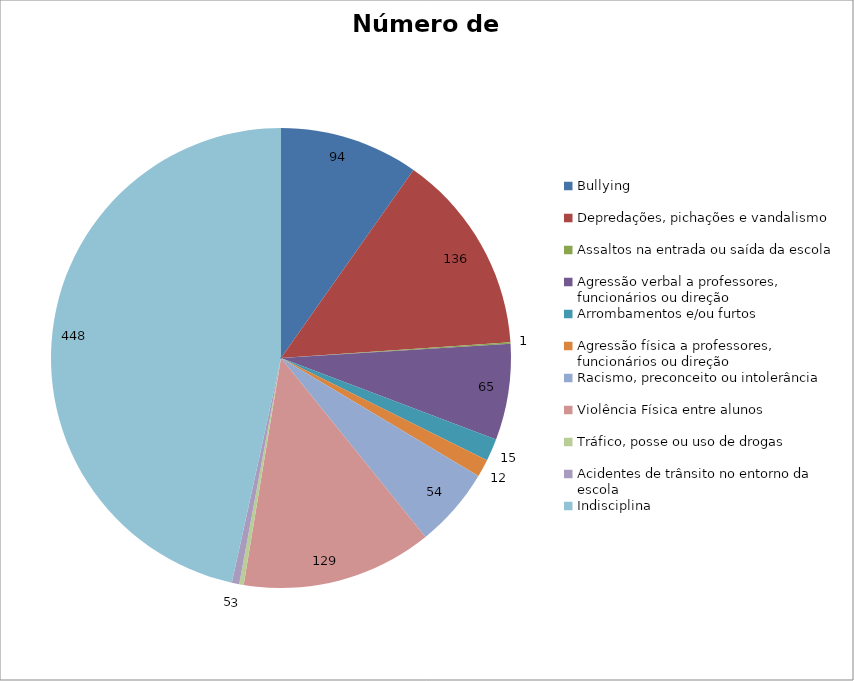
| Category | Número de Casos |
|---|---|
| Bullying | 94 |
| Depredações, pichações e vandalismo | 136 |
| Assaltos na entrada ou saída da escola | 1 |
| Agressão verbal a professores, funcionários ou direção | 65 |
| Arrombamentos e/ou furtos | 15 |
| Agressão física a professores, funcionários ou direção | 12 |
| Racismo, preconceito ou intolerância | 54 |
| Violência Física entre alunos | 129 |
| Tráfico, posse ou uso de drogas | 3 |
| Acidentes de trânsito no entorno da escola | 5 |
| Indisciplina | 448 |